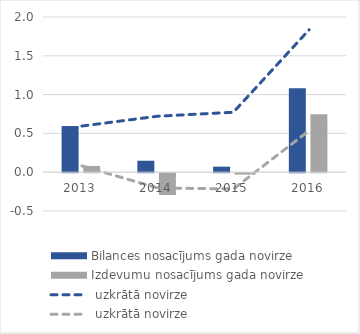
| Category | Bilances nosacījums | Izdevumu nosacījums |
|---|---|---|
| 2013.0 | 0.595 | 0.081 |
| 2014.0 | 0.148 | -0.281 |
| 2015.0 | 0.071 | -0.018 |
| 2016.0 | 1.081 | 0.746 |